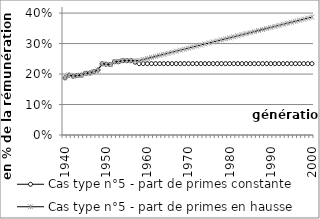
| Category | Cas type n°5 - part de primes constante | Cas type n°5 - part de primes en hausse |
|---|---|---|
| 1940.0 | 0.188 | 0.188 |
| 1941.0 | 0.197 | 0.197 |
| 1942.0 | 0.193 | 0.193 |
| 1943.0 | 0.195 | 0.195 |
| 1944.0 | 0.196 | 0.196 |
| 1945.0 | 0.202 | 0.202 |
| 1946.0 | 0.203 | 0.203 |
| 1947.0 | 0.208 | 0.208 |
| 1948.0 | 0.213 | 0.213 |
| 1949.0 | 0.234 | 0.234 |
| 1950.0 | 0.232 | 0.232 |
| 1951.0 | 0.231 | 0.231 |
| 1952.0 | 0.24 | 0.24 |
| 1953.0 | 0.241 | 0.241 |
| 1954.0 | 0.244 | 0.244 |
| 1955.0 | 0.244 | 0.244 |
| 1956.0 | 0.244 | 0.244 |
| 1957.0 | 0.239 | 0.244 |
| 1958.0 | 0.234 | 0.244 |
| 1959.0 | 0.234 | 0.248 |
| 1960.0 | 0.234 | 0.251 |
| 1961.0 | 0.234 | 0.255 |
| 1962.0 | 0.234 | 0.258 |
| 1963.0 | 0.234 | 0.261 |
| 1964.0 | 0.234 | 0.265 |
| 1965.0 | 0.234 | 0.268 |
| 1966.0 | 0.234 | 0.271 |
| 1967.0 | 0.234 | 0.275 |
| 1968.0 | 0.234 | 0.278 |
| 1969.0 | 0.234 | 0.282 |
| 1970.0 | 0.234 | 0.285 |
| 1971.0 | 0.234 | 0.288 |
| 1972.0 | 0.234 | 0.292 |
| 1973.0 | 0.234 | 0.295 |
| 1974.0 | 0.234 | 0.299 |
| 1975.0 | 0.234 | 0.302 |
| 1976.0 | 0.234 | 0.305 |
| 1977.0 | 0.234 | 0.309 |
| 1978.0 | 0.234 | 0.312 |
| 1979.0 | 0.234 | 0.316 |
| 1980.0 | 0.234 | 0.319 |
| 1981.0 | 0.234 | 0.322 |
| 1982.0 | 0.234 | 0.326 |
| 1983.0 | 0.234 | 0.329 |
| 1984.0 | 0.234 | 0.333 |
| 1985.0 | 0.234 | 0.336 |
| 1986.0 | 0.234 | 0.339 |
| 1987.0 | 0.234 | 0.343 |
| 1988.0 | 0.234 | 0.346 |
| 1989.0 | 0.234 | 0.35 |
| 1990.0 | 0.234 | 0.353 |
| 1991.0 | 0.234 | 0.356 |
| 1992.0 | 0.234 | 0.36 |
| 1993.0 | 0.234 | 0.363 |
| 1994.0 | 0.234 | 0.366 |
| 1995.0 | 0.234 | 0.37 |
| 1996.0 | 0.234 | 0.373 |
| 1997.0 | 0.234 | 0.377 |
| 1998.0 | 0.234 | 0.38 |
| 1999.0 | 0.234 | 0.383 |
| 2000.0 | 0.234 | 0.387 |